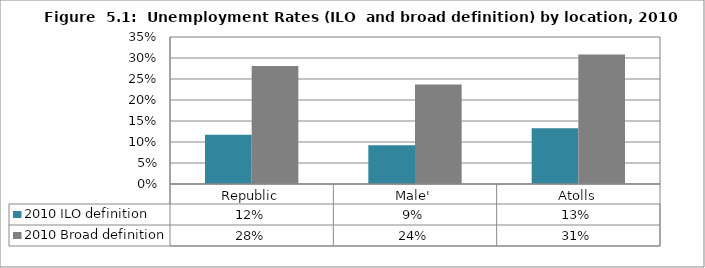
| Category | 2010 ILO definition | 2010 Broad definition |
|---|---|---|
| Republic | 0.117 | 0.281 |
| Male' | 0.092 | 0.237 |
| Atolls | 0.133 | 0.308 |